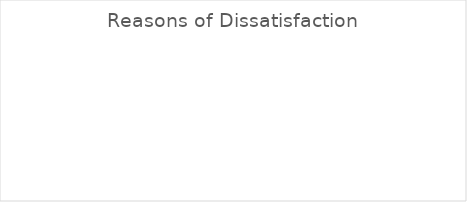
| Category | Series 0 |
|---|---|
| food and formula choices | 0 |
| shopping issues | 0 |
| clinic wait time too long | 0 |
| poor customer service | 0 |